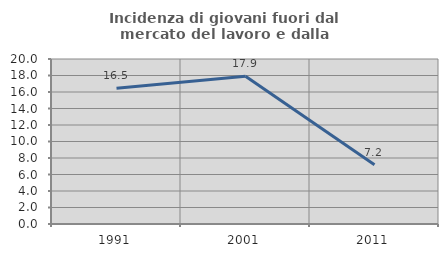
| Category | Incidenza di giovani fuori dal mercato del lavoro e dalla formazione  |
|---|---|
| 1991.0 | 16.466 |
| 2001.0 | 17.904 |
| 2011.0 | 7.19 |